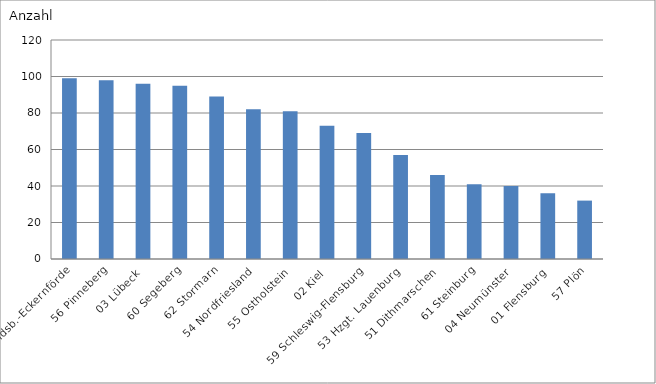
| Category | 58 Rendsb.-Eckernförde |
|---|---|
| 58 Rendsb.-Eckernförde | 99 |
| 56 Pinneberg | 98 |
| 03 Lübeck | 96 |
| 60 Segeberg | 95 |
| 62 Stormarn | 89 |
| 54 Nordfriesland | 82 |
| 55 Ostholstein | 81 |
| 02 Kiel | 73 |
| 59 Schleswig-Flensburg | 69 |
| 53 Hzgt. Lauenburg | 57 |
| 51 Dithmarschen | 46 |
| 61 Steinburg | 41 |
| 04 Neumünster | 40 |
| 01 Flensburg | 36 |
| 57 Plön | 32 |